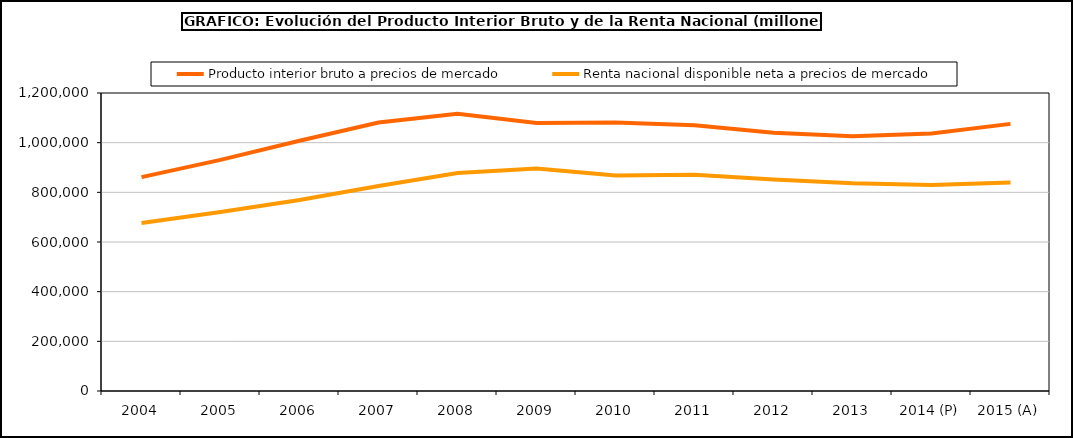
| Category | Producto interior bruto a precios de mercado | Renta nacional disponible neta a precios de mercado |
|---|---|---|
| 2004 | 861420 | 676423 |
| 2005 | 930566 | 720960 |
| 2006 | 1007974 | 769191 |
| 2007 | 1080807 | 825243 |
| 2008 | 1116207 | 877626 |
| 2009 | 1079034 | 896297 |
| 2010 | 1080913 | 867973 |
| 2011 | 1070413 | 871015 |
| 2012 | 1039758 | 851948 |
| 2013 | 1025634 | 836933 |
| 2014 (P) | 1037025 | 829954 |
| 2015 (A) | 1075639 | 839636 |